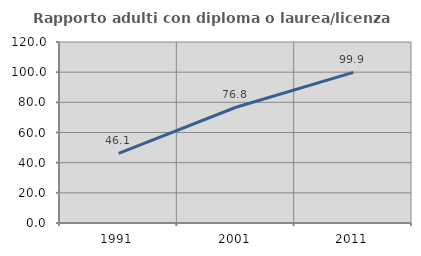
| Category | Rapporto adulti con diploma o laurea/licenza media  |
|---|---|
| 1991.0 | 46.118 |
| 2001.0 | 76.753 |
| 2011.0 | 99.855 |